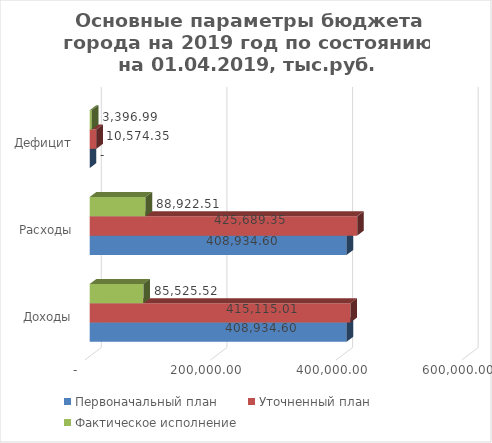
| Category | Первоначальный план | Уточненный план | Фактическое исполнение |
|---|---|---|---|
| Доходы | 408934.598 | 415115.006 | 85525.516 |
| Расходы | 408934.598 | 425689.354 | 88922.51 |
| Дефицит | 0 | 10574.348 | 3396.994 |